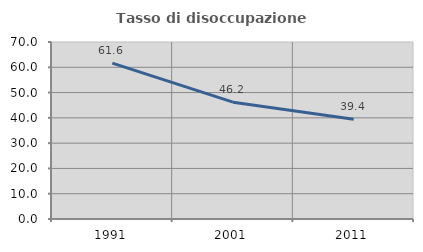
| Category | Tasso di disoccupazione giovanile  |
|---|---|
| 1991.0 | 61.637 |
| 2001.0 | 46.207 |
| 2011.0 | 39.416 |